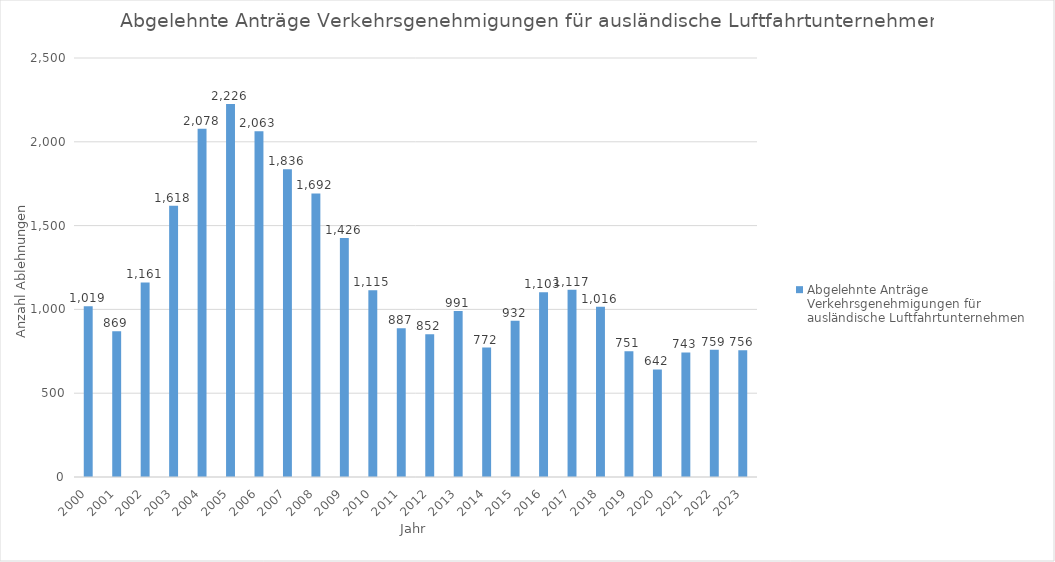
| Category | Abgelehnte Anträge Verkehrsgenehmigungen für ausländische Luftfahrtunternehmen  |
|---|---|
| 2000.0 | 1019 |
| 2001.0 | 869 |
| 2002.0 | 1161 |
| 2003.0 | 1618 |
| 2004.0 | 2078 |
| 2005.0 | 2226 |
| 2006.0 | 2063 |
| 2007.0 | 1836 |
| 2008.0 | 1692 |
| 2009.0 | 1426 |
| 2010.0 | 1115 |
| 2011.0 | 887 |
| 2012.0 | 852 |
| 2013.0 | 991 |
| 2014.0 | 772 |
| 2015.0 | 932 |
| 2016.0 | 1103 |
| 2017.0 | 1117 |
| 2018.0 | 1016 |
| 2019.0 | 751 |
| 2020.0 | 642 |
| 2021.0 | 743 |
| 2022.0 | 759 |
| 2023.0 | 756 |